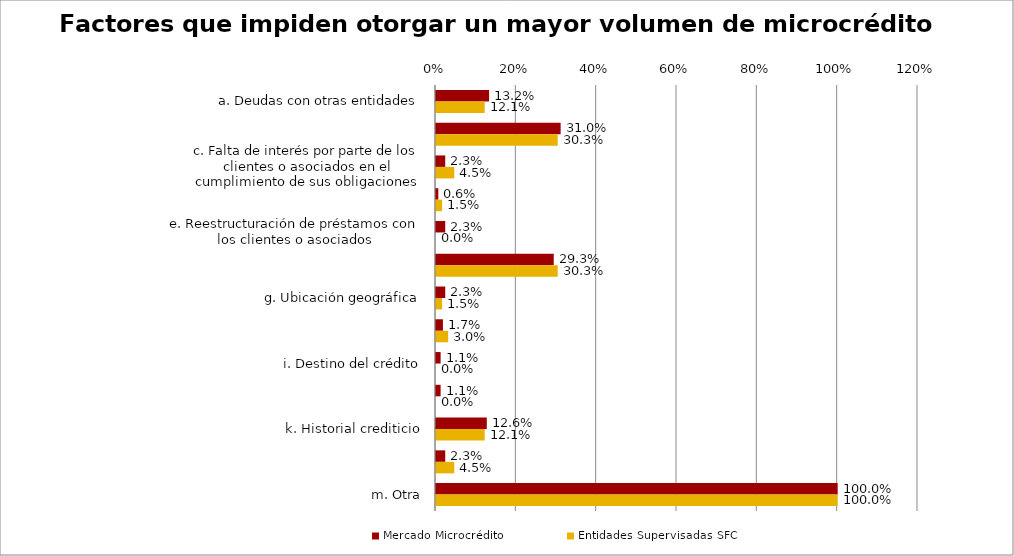
| Category | Mercado Microcrédito | Entidades Supervisadas SFC |
|---|---|---|
| a. Deudas con otras entidades | 0.132 | 0.121 |
| b. Capacidad de pago de los clientes | 0.31 | 0.303 |
| c. Falta de interés por parte de los clientes o asociados en el cumplimiento de sus obligaciones | 0.023 | 0.045 |
| d. Actividad económica del cliente o asocidado | 0.006 | 0.015 |
| e. Reestructuración de préstamos con los clientes o asociados | 0.023 | 0 |
| f. El nivel de deuda del cliente, con su entidad o con otras instituciones, es superior a su capacidad de pago (sobrendeudamiento) | 0.293 | 0.303 |
| g. Ubicación geográfica | 0.023 | 0.015 |
| h. Poca experiencia en su actividad económica | 0.017 | 0.03 |
| i. Destino del crédito | 0.011 | 0 |
| j. Falta de información financiera de los nuevos clientes o asociados | 0.011 | 0 |
| k. Historial crediticio | 0.126 | 0.121 |
| l. Medidas adoptadas por los entes reguladores | 0.023 | 0.045 |
| m. Otra | 1 | 1 |